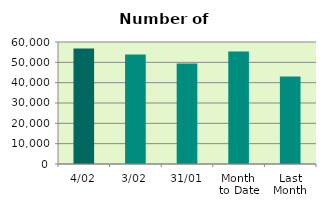
| Category | Series 0 |
|---|---|
| 4/02 | 56840 |
| 3/02 | 53836 |
| 31/01 | 49378 |
| Month 
to Date | 55338 |
| Last
Month | 43047.455 |